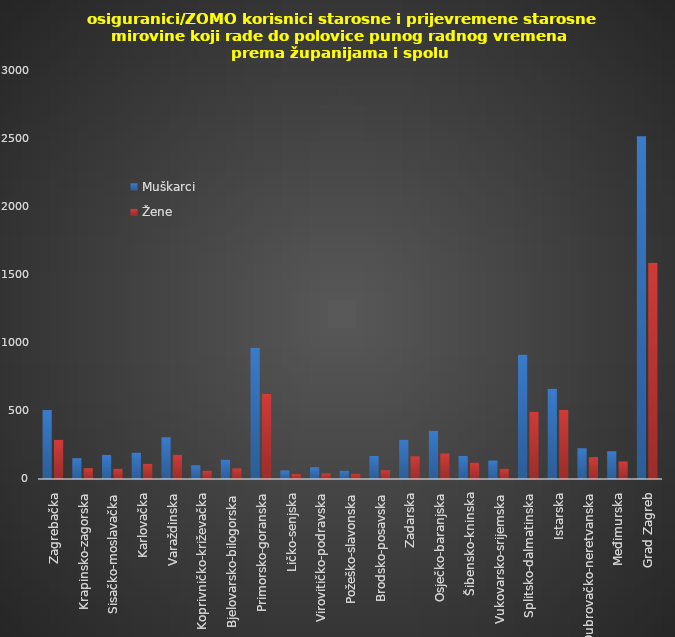
| Category | Muškarci | Žene |
|---|---|---|
| Zagrebačka | 507 | 288 |
| Krapinsko-zagorska | 153 | 80 |
| Sisačko-moslavačka | 177 | 76 |
| Karlovačka | 194 | 112 |
| Varaždinska | 307 | 178 |
| Koprivničko-križevačka | 101 | 61 |
| Bjelovarsko-bilogorska | 143 | 78 |
| Primorsko-goranska | 965 | 626 |
| Ličko-senjska | 63 | 36 |
| Virovitičko-podravska | 87 | 41 |
| Požeško-slavonska | 61 | 38 |
| Brodsko-posavska | 169 | 65 |
| Zadarska | 290 | 167 |
| Osječko-baranjska | 355 | 188 |
| Šibensko-kninska | 169 | 121 |
| Vukovarsko-srijemska | 136 | 76 |
| Splitsko-dalmatinska | 913 | 494 |
| Istarska | 663 | 508 |
| Dubrovačko-neretvanska | 226 | 161 |
| Međimurska | 204 | 129 |
| Grad Zagreb | 2520 | 1590 |